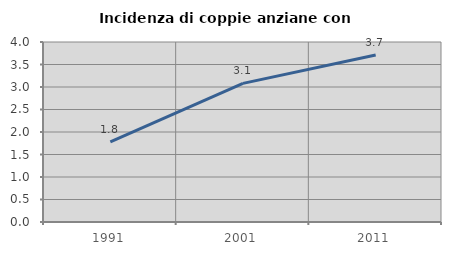
| Category | Incidenza di coppie anziane con figli |
|---|---|
| 1991.0 | 1.779 |
| 2001.0 | 3.08 |
| 2011.0 | 3.711 |